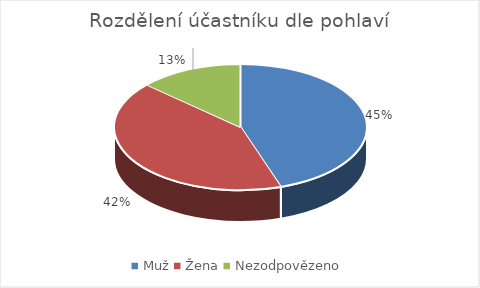
| Category | Series 0 |
|---|---|
| Muž | 152 |
| Žena | 142 |
| Nezodpovězeno | 45 |